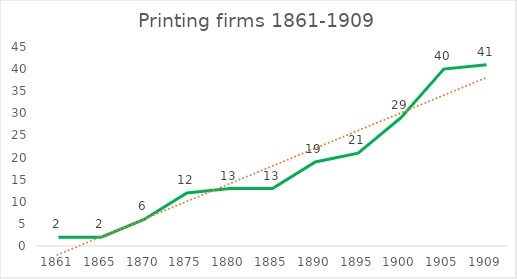
| Category | Series 1 |
|---|---|
| 1861.0 | 2 |
| 1865.0 | 2 |
| 1870.0 | 6 |
| 1875.0 | 12 |
| 1880.0 | 13 |
| 1885.0 | 13 |
| 1890.0 | 19 |
| 1895.0 | 21 |
| 1900.0 | 29 |
| 1905.0 | 40 |
| 1909.0 | 41 |